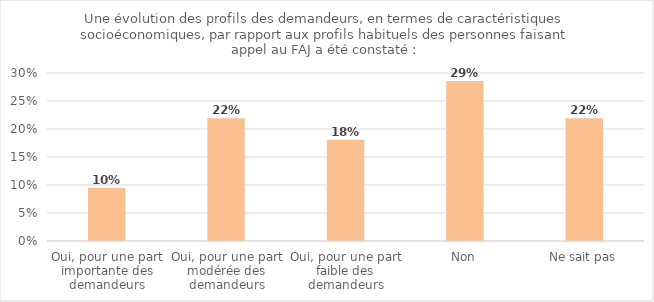
| Category | Series 0 |
|---|---|
| Oui, pour une part importante des demandeurs | 0.095 |
| Oui, pour une part modérée des demandeurs | 0.219 |
| Oui, pour une part faible des demandeurs | 0.181 |
| Non | 0.286 |
| Ne sait pas | 0.219 |